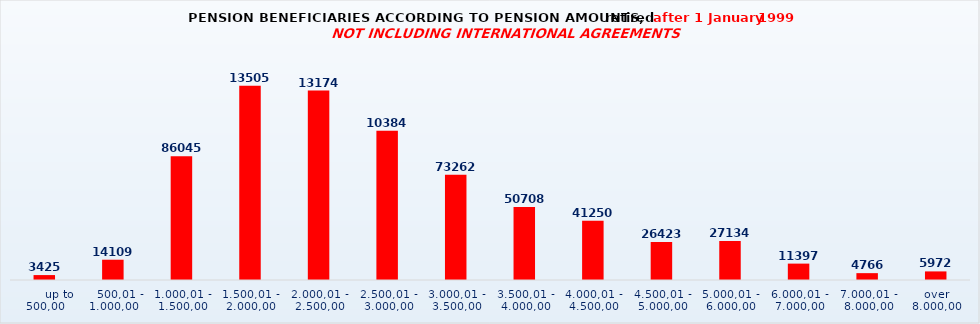
| Category | Series 0 |
|---|---|
|       up to 500,00 | 3425 |
|    500,01 - 1.000,00 | 14109 |
| 1.000,01 - 1.500,00 | 86045 |
| 1.500,01 - 2.000,00 | 135053 |
| 2.000,01 - 2.500,00 | 131744 |
| 2.500,01 - 3.000,00 | 103840 |
| 3.000,01 - 3.500,00 | 73262 |
| 3.500,01 - 4.000,00 | 50708 |
| 4.000,01 - 4.500,00 | 41250 |
| 4.500,01 - 5.000,00 | 26423 |
| 5.000,01 - 6.000,00 | 27134 |
| 6.000,01 - 7.000,00 | 11397 |
| 7.000,01 - 8.000,00 | 4766 |
| over 8.000,00 | 5972 |